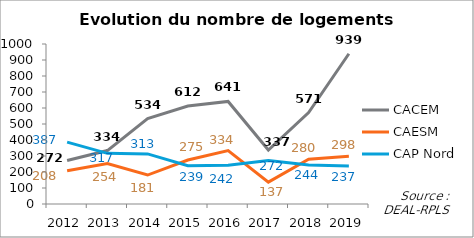
| Category | CACEM | CAESM | CAP Nord |
|---|---|---|---|
| 2012.0 | 272 | 208 | 387 |
| 2013.0 | 334.011 | 253.538 | 316.549 |
| 2014.0 | 534 | 181 | 313.017 |
| 2015.0 | 612 | 275 | 239 |
| 2016.0 | 641 | 334 | 242 |
| 2017.0 | 337 | 137 | 272 |
| 2018.0 | 571 | 280 | 244 |
| 2019.0 | 939 | 298 | 237 |